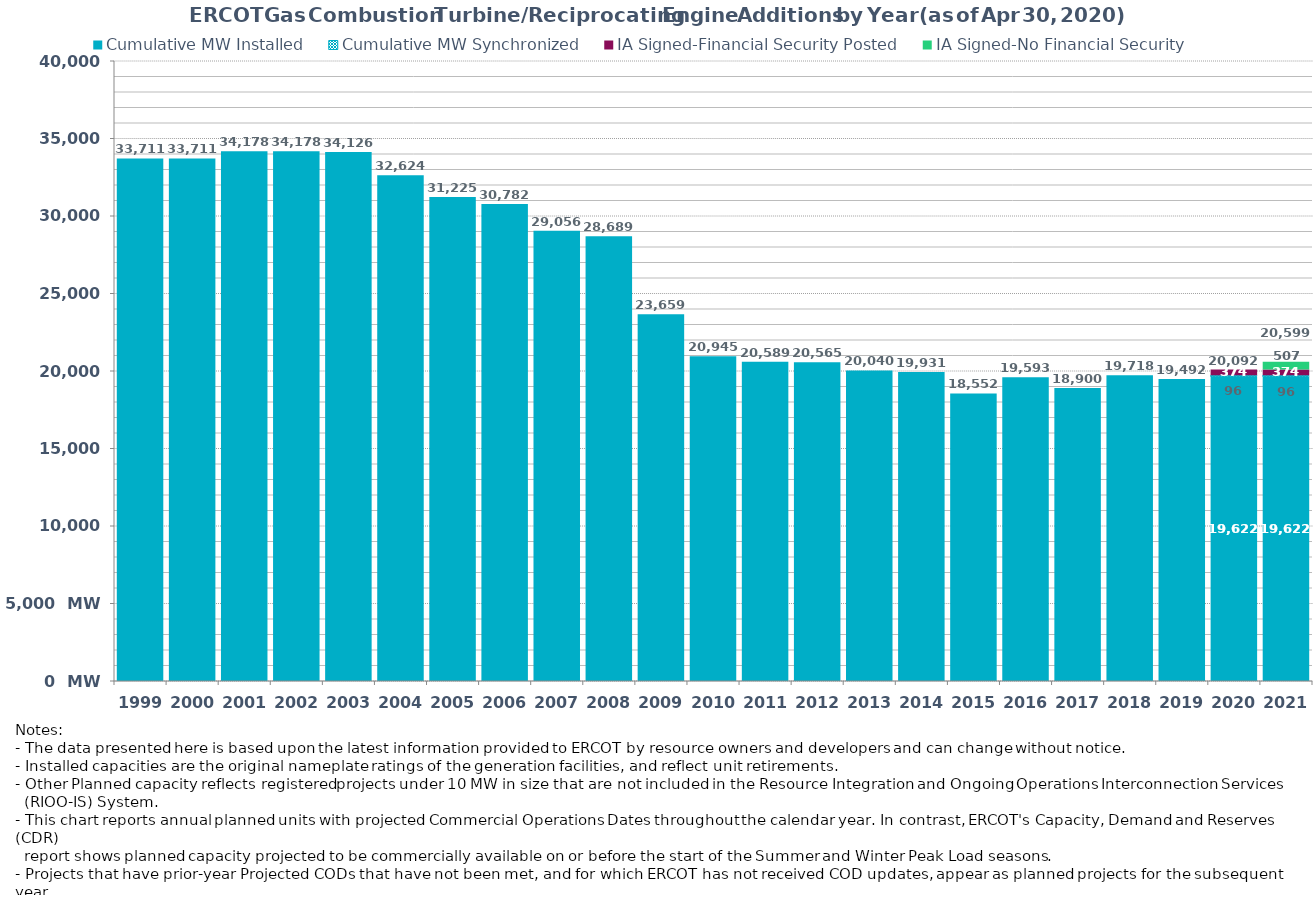
| Category | Cumulative MW Installed | Cumulative MW Synchronized | IA Signed-Financial Security Posted  | IA Signed-No Financial Security  | Other Planned | Cumulative Installed and Planned |
|---|---|---|---|---|---|---|
| 1999.0 | 33711.2 | 0 | 0 | 0 | 0 | 33711.2 |
| 2000.0 | 33711.2 | 0 | 0 | 0 | 0 | 33711.2 |
| 2001.0 | 34178.2 | 0 | 0 | 0 | 0 | 34178.2 |
| 2002.0 | 34178.2 | 0 | 0 | 0 | 0 | 34178.2 |
| 2003.0 | 34126.2 | 0 | 0 | 0 | 0 | 34126.2 |
| 2004.0 | 32624.2 | 0 | 0 | 0 | 0 | 32624.2 |
| 2005.0 | 31225.2 | 0 | 0 | 0 | 0 | 31225.2 |
| 2006.0 | 30782.2 | 0 | 0 | 0 | 0 | 30782.2 |
| 2007.0 | 29056.2 | 0 | 0 | 0 | 0 | 29056.2 |
| 2008.0 | 28689.2 | 0 | 0 | 0 | 0 | 28689.2 |
| 2009.0 | 23659.2 | 0 | 0 | 0 | 0 | 23659.2 |
| 2010.0 | 20945.2 | 0 | 0 | 0 | 0 | 20945.2 |
| 2011.0 | 20589 | 0 | 0 | 0 | 0 | 20589 |
| 2012.0 | 20565 | 0 | 0 | 0 | 0 | 20565 |
| 2013.0 | 20040 | 0 | 0 | 0 | 0 | 20040 |
| 2014.0 | 19931 | 0 | 0 | 0 | 0 | 19931 |
| 2015.0 | 18552 | 0 | 0 | 0 | 0 | 18552 |
| 2016.0 | 19592.72 | 0 | 0 | 0 | 0 | 19592.72 |
| 2017.0 | 18900.08 | 0 | 0 | 0 | 0 | 18900.08 |
| 2018.0 | 19718.44 | 0 | 0 | 0 | 0 | 19718.44 |
| 2019.0 | 19491.84 | 0 | 0 | 0 | 0 | 19491.84 |
| 2020.0 | 19622.34 | 96 | 374 | 0 | 0 | 20092.34 |
| 2021.0 | 19622.34 | 96 | 374 | 507 | 0 | 20599.34 |